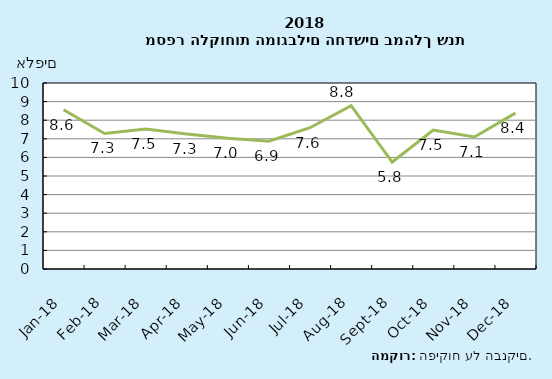
| Category | לקוחות חדשים |
|---|---|
| 2018-01-31 | 8.562 |
| 2018-02-28 | 7.286 |
| 2018-03-31 | 7.528 |
| 2018-04-30 | 7.258 |
| 2018-05-31 | 7.029 |
| 2018-06-30 | 6.866 |
| 2018-07-31 | 7.596 |
| 2018-08-31 | 8.786 |
| 2018-09-30 | 5.751 |
| 2018-10-31 | 7.47 |
| 2018-11-30 | 7.097 |
| 2018-12-31 | 8.381 |